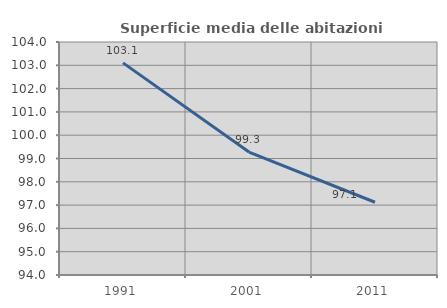
| Category | Superficie media delle abitazioni occupate |
|---|---|
| 1991.0 | 103.105 |
| 2001.0 | 99.276 |
| 2011.0 | 97.122 |